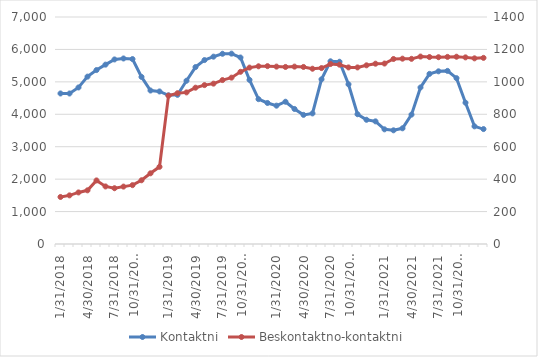
| Category | Kontaktni |
|---|---|
| 31.1.2018 | 4642 |
| 28.2.2018 | 4641 |
| 31.3.2018 | 4827 |
| 30.4.2018 | 5161 |
| 31.5.2018 | 5364 |
| 30.6.2018 | 5531 |
| 31.7.2018 | 5691 |
| 31.8.2018 | 5721 |
| 30.9.2018 | 5703 |
| 31.10.2018 | 5153 |
| 30.11.2018 | 4733 |
| 31.12.2018 | 4704 |
| 31.1.2019 | 4585 |
| 28.2.2019 | 4600 |
| 31.3.2019 | 5035 |
| 30.4.2019 | 5456 |
| 31.5.2019 | 5672 |
| 30.6.2019 | 5777 |
| 31.7.2019 | 5866 |
| 31.8.2019 | 5870 |
| 30.9.2019 | 5751 |
| 31.10.2019 | 5061 |
| 30.11.2019 | 4467 |
| 31.12.2019 | 4349 |
| 31.1.2020 | 4266 |
| 29.2.2020 | 4387 |
| 31.3.2020 | 4164 |
| 30.4.2020 | 3982 |
| 31.5.2020 | 4027 |
| 30.6.2020 | 5078 |
| 31.7.2020 | 5634 |
| 31.8.2020 | 5620 |
| 30.9.2020 | 4925 |
| 31.10.2020 | 4002 |
| 30.11.2020 | 3831 |
| 31.12.2020 | 3782 |
| 31.1.2021 | 3536 |
| 29.2.2021 | 3506 |
| 31.3.2021 | 3568 |
| 30.4.2021 | 3990 |
| 31.5.2021 | 4827 |
| 30.6.2021 | 5246 |
| 31.7.2021 | 5325 |
| 31.8.2021 | 5338 |
| 30.9.2021 | 5114 |
| 31.10.2021 | 4357 |
| 30.11.2021 | 3628 |
| 31.12.2021 | 3544 |